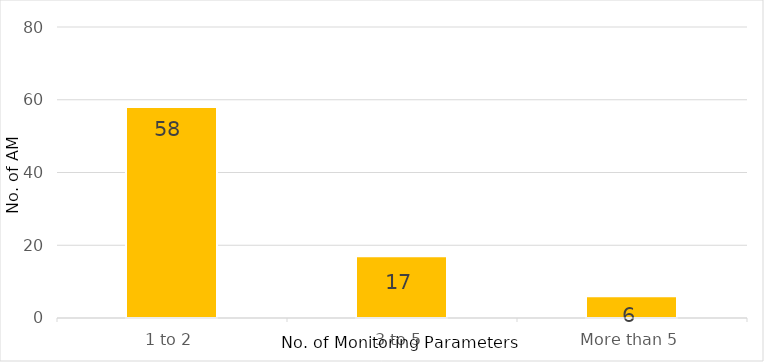
| Category | Series 0 |
|---|---|
| 0 | 58 |
| 1 | 17 |
| 2 | 6 |